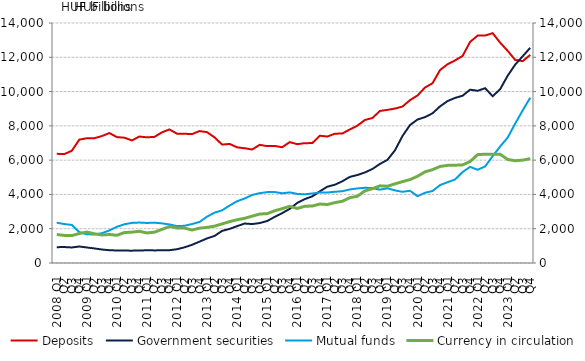
| Category | Deposits | Government securities |
|---|---|---|
| 2008 Q1 | 6369.078 | 923.097 |
| Q2 | 6353.118 | 931.39 |
| Q3 | 6545.865 | 906.504 |
| Q4 | 7195.751 | 962.149 |
| 2009 Q1 | 7279.039 | 905.838 |
| Q2 | 7280.739 | 850.708 |
| Q3 | 7401.98 | 786.905 |
| Q4 | 7581.462 | 746.744 |
| 2010 Q1 | 7344.556 | 729.781 |
| Q2 | 7309.284 | 723.671 |
| Q3 | 7151.434 | 720.547 |
| Q4 | 7376.127 | 729.849 |
| 2011 Q1 | 7331.236 | 741.081 |
| Q2 | 7357.487 | 735.56 |
| Q3 | 7620.95 | 738.711 |
| Q4 | 7792.493 | 748.232 |
| 2012 Q1 | 7541.756 | 802.887 |
| Q2 | 7538.73 | 915.513 |
| Q3 | 7518.398 | 1061.912 |
| Q4 | 7697.379 | 1245.713 |
| 2013 Q1 | 7631.341 | 1436.118 |
| Q2 | 7325.034 | 1579.732 |
| Q3 | 6907.43 | 1871.773 |
| Q4 | 6946.278 | 1990.515 |
| 2014 Q1 | 6748.188 | 2148.923 |
| Q2 | 6694.451 | 2301.95 |
| Q3 | 6621.693 | 2270.877 |
| Q4 | 6892.237 | 2329.773 |
| 2015 Q1 | 6818.008 | 2449.915 |
| Q2 | 6826.452 | 2691.503 |
| Q3 | 6754.516 | 2910.544 |
| Q4 | 7051.513 | 3159.8 |
| 2016 Q1 | 6930.932 | 3506.213 |
| Q2 | 6991.037 | 3726.482 |
| Q3 | 6994.031 | 3888.133 |
| Q4 | 7424.79 | 4178.84 |
| 2017 Q1 | 7377.157 | 4451.344 |
| Q2 | 7541.027 | 4565.608 |
| Q3 | 7554.234 | 4767.429 |
| Q4 | 7791.066 | 5024.922 |
| 2018 Q1 | 8012.701 | 5131.929 |
| Q2 | 8341.826 | 5281.653 |
| Q3 | 8458.359 | 5484.123 |
| Q4 | 8868.953 | 5778.729 |
| 2019 Q1 | 8934.014 | 6017.98 |
| Q2 | 9008.278 | 6572.216 |
| Q3 | 9125.526 | 7407.438 |
| Q4 | 9499.629 | 8047.086 |
| 2020 Q1 | 9772.197 | 8369.14 |
| Q2 | 10235.749 | 8510.235 |
| Q3 | 10486.847 | 8733.518 |
| Q4 | 11255.255 | 9135.601 |
| 2021 Q1 | 11596.913 | 9446.905 |
| Q2 | 11817.469 | 9629.955 |
| Q3 | 12080.462 | 9757.916 |
| Q4 | 12899.115 | 10110.003 |
| 2022 Q1 | 13264.434 | 10045.567 |
| Q2 | 13268.665 | 10196.268 |
| Q3 | 13407.094 | 9729.02 |
| Q4 | 12850.828 | 10140.231 |
| 2023 Q1 | 12374.025 | 10927.553 |
| Q2 | 11845.642 | 11573.326 |
| Q3 | 11777.203 | 12062.158 |
| Q4 | 12138.611 | 12554.129 |